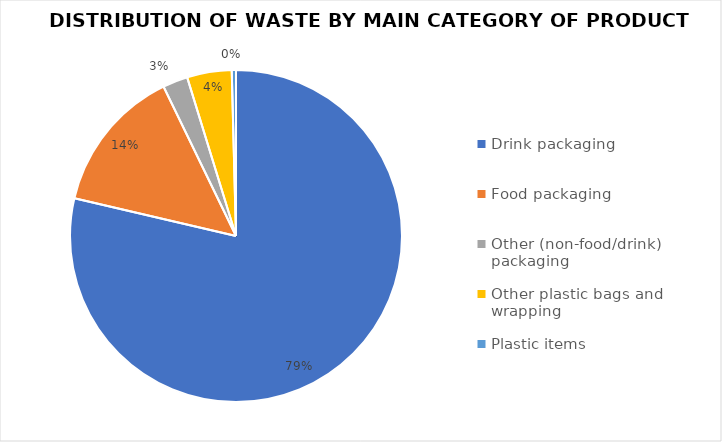
| Category | Series 0 |
|---|---|
| Drink packaging | 1682.856 |
| Food packaging | 302.862 |
| Other (non-food/drink) packaging | 52.124 |
| Other plastic bags and wrapping | 92.86 |
| Plastic items | 8.8 |